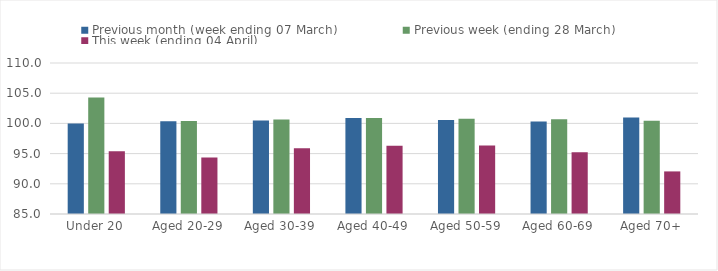
| Category | Previous month (week ending 07 March) | Previous week (ending 28 March) | This week (ending 04 April) |
|---|---|---|---|
| Under 20 | 99.972 | 104.299 | 95.375 |
| Aged 20-29 | 100.373 | 100.41 | 94.342 |
| Aged 30-39 | 100.469 | 100.629 | 95.887 |
| Aged 40-49 | 100.906 | 100.91 | 96.298 |
| Aged 50-59 | 100.544 | 100.776 | 96.337 |
| Aged 60-69 | 100.329 | 100.706 | 95.227 |
| Aged 70+ | 100.986 | 100.458 | 92.051 |